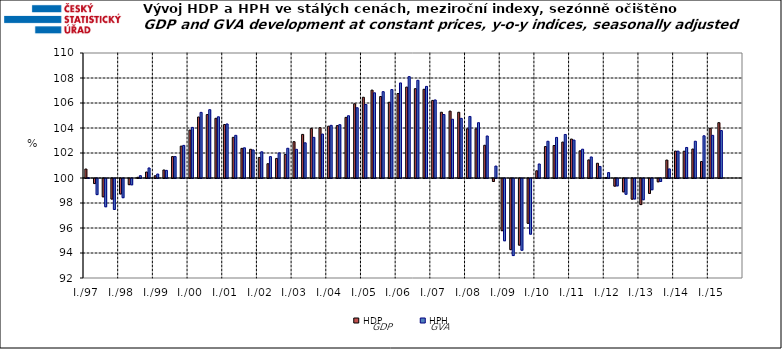
| Category | HDP

 | HPH

 |
|---|---|---|
| I./97 | 100.719 | 100.021 |
|  | 99.596 | 98.712 |
|  | 98.536 | 97.74 |
|  | 98.355 | 97.524 |
| I./98 | 98.765 | 98.464 |
|  | 99.507 | 99.495 |
|  | 100.057 | 100.186 |
|  | 100.478 | 100.803 |
| I./99 | 100.18 | 100.32 |
|  | 100.642 | 100.61 |
|  | 101.716 | 101.715 |
|  | 102.55 | 102.609 |
| I./00 | 103.834 | 104.048 |
|  | 104.88 | 105.25 |
|  | 105.074 | 105.467 |
|  | 104.776 | 104.896 |
| I./01 | 104.28 | 104.323 |
|  | 103.254 | 103.413 |
|  | 102.37 | 102.416 |
|  | 102.299 | 102.244 |
| I./02 | 101.647 | 102.096 |
|  | 101.143 | 101.711 |
|  | 101.565 | 102.005 |
|  | 101.886 | 102.379 |
| I./03 | 102.905 | 102.294 |
|  | 103.488 | 102.816 |
|  | 103.966 | 103.252 |
|  | 104.026 | 103.516 |
| I./04 | 104.147 | 104.214 |
|  | 104.194 | 104.266 |
|  | 104.85 | 104.981 |
|  | 105.941 | 105.62 |
| I./05 | 106.461 | 105.883 |
|  | 107.031 | 106.815 |
|  | 106.521 | 106.907 |
|  | 106.062 | 107.074 |
| I./06 | 106.759 | 107.604 |
|  | 107.274 | 108.11 |
|  | 107.145 | 107.817 |
|  | 107.097 | 107.328 |
| I./07 | 106.209 | 106.244 |
|  | 105.261 | 105.079 |
|  | 105.35 | 104.699 |
|  | 105.26 | 104.773 |
| I./08 | 103.935 | 104.923 |
|  | 103.929 | 104.424 |
|  | 102.619 | 103.362 |
|  | 99.761 | 100.954 |
| I./09 | 95.826 | 95.018 |
|  | 94.308 | 93.836 |
|  | 94.669 | 94.26 |
|  | 96.416 | 95.548 |
| I./10 | 100.577 | 101.122 |
|  | 102.515 | 102.939 |
|  | 102.599 | 103.247 |
|  | 102.875 | 103.483 |
| I./11 | 103.116 | 103.036 |
|  | 102.174 | 102.305 |
|  | 101.448 | 101.684 |
|  | 101.18 | 100.927 |
| I./12 | 100.044 | 100.433 |
|  | 99.388 | 99.411 |
|  | 98.933 | 98.739 |
|  | 98.346 | 98.362 |
| I./13 | 97.913 | 98.301 |
|  | 98.807 | 99.101 |
|  | 99.737 | 99.765 |
|  | 101.437 | 100.725 |
| I./14 | 102.156 | 102.149 |
|  | 102.142 | 102.444 |
|  | 102.317 | 102.942 |
|  | 101.317 | 103.377 |
| I./15 | 103.974 | 103.413 |